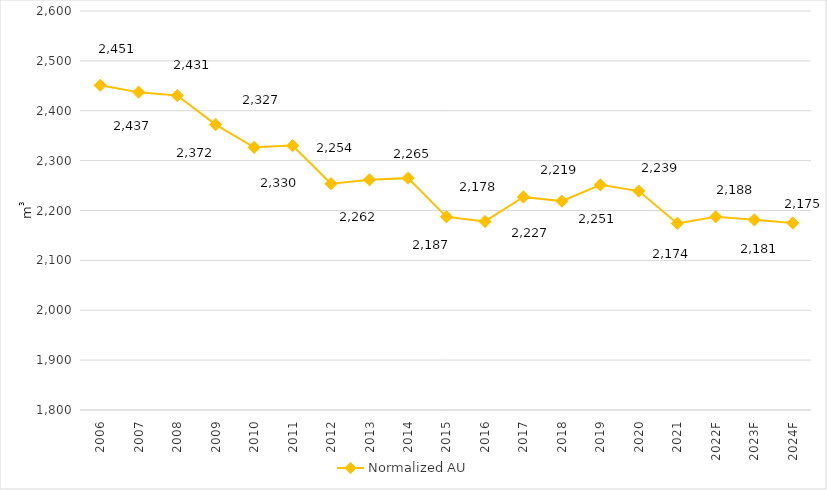
| Category | Normalized AU |
|---|---|
| 2006 | 2451.088 |
| 2007 | 2437.257 |
| 2008 | 2430.571 |
| 2009 | 2372.276 |
| 2010 | 2326.74 |
| 2011 | 2330.161 |
| 2012 | 2253.711 |
| 2013 | 2261.631 |
| 2014 | 2264.885 |
| 2015 | 2187.244 |
| 2016 | 2178.104 |
| 2017 | 2227.249 |
| 2018 | 2218.826 |
| 2019 | 2251.423 |
| 2020 | 2238.947 |
| 2021 | 2174.02 |
| 2022F | 2187.559 |
| 2023F | 2181.213 |
| 2024F | 2175.101 |